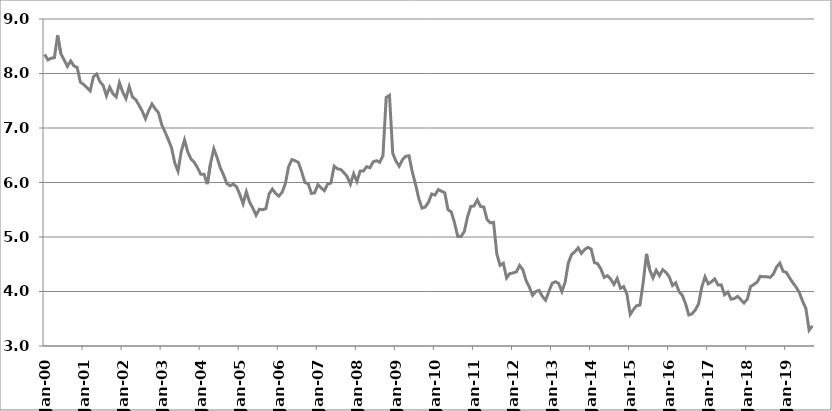
| Category | Series 1 |
|---|---|
| 2000-01-01 | 8.35 |
| 2000-02-01 | 8.25 |
| 2000-03-01 | 8.28 |
| 2000-04-01 | 8.29 |
| 2000-05-01 | 8.7 |
| 2000-06-01 | 8.36 |
| 2000-07-01 | 8.25 |
| 2000-08-01 | 8.13 |
| 2000-09-01 | 8.23 |
| 2000-10-01 | 8.14 |
| 2000-11-01 | 8.11 |
| 2000-12-01 | 7.84 |
| 2001-01-01 | 7.8 |
| 2001-02-01 | 7.74 |
| 2001-03-01 | 7.68 |
| 2001-04-01 | 7.94 |
| 2001-05-01 | 7.99 |
| 2001-06-01 | 7.85 |
| 2001-07-01 | 7.78 |
| 2001-08-01 | 7.59 |
| 2001-09-01 | 7.75 |
| 2001-10-01 | 7.63 |
| 2001-11-01 | 7.57 |
| 2001-12-01 | 7.83 |
| 2002-01-01 | 7.66 |
| 2002-02-01 | 7.54 |
| 2002-03-01 | 7.76 |
| 2002-04-01 | 7.57 |
| 2002-05-01 | 7.52 |
| 2002-06-01 | 7.42 |
| 2002-07-01 | 7.31 |
| 2002-08-01 | 7.17 |
| 2002-09-01 | 7.32 |
| 2002-10-01 | 7.44 |
| 2002-11-01 | 7.35 |
| 2002-12-01 | 7.28 |
| 2003-01-01 | 7.06 |
| 2003-02-01 | 6.93 |
| 2003-03-01 | 6.79 |
| 2003-04-01 | 6.64 |
| 2003-05-01 | 6.36 |
| 2003-06-01 | 6.21 |
| 2003-07-01 | 6.57 |
| 2003-08-01 | 6.78 |
| 2003-09-01 | 6.56 |
| 2003-10-01 | 6.43 |
| 2003-11-01 | 6.37 |
| 2003-12-01 | 6.27 |
| 2004-01-01 | 6.15 |
| 2004-02-01 | 6.15 |
| 2004-03-01 | 5.97 |
| 2004-04-01 | 6.35 |
| 2004-05-01 | 6.62 |
| 2004-06-01 | 6.46 |
| 2004-07-01 | 6.27 |
| 2004-08-01 | 6.14 |
| 2004-09-01 | 5.98 |
| 2004-10-01 | 5.94 |
| 2004-11-01 | 5.97 |
| 2004-12-01 | 5.92 |
| 2005-01-01 | 5.78 |
| 2005-02-01 | 5.61 |
| 2005-03-01 | 5.83 |
| 2005-04-01 | 5.64 |
| 2005-05-01 | 5.53 |
| 2005-06-01 | 5.4 |
| 2005-07-01 | 5.51 |
| 2005-08-01 | 5.5 |
| 2005-09-01 | 5.52 |
| 2005-10-01 | 5.79 |
| 2005-11-01 | 5.88 |
| 2005-12-01 | 5.8 |
| 2006-01-01 | 5.75 |
| 2006-02-01 | 5.82 |
| 2006-03-01 | 5.98 |
| 2006-04-01 | 6.29 |
| 2006-05-01 | 6.42 |
| 2006-06-01 | 6.4 |
| 2006-07-01 | 6.37 |
| 2006-08-01 | 6.2 |
| 2006-09-01 | 6 |
| 2006-10-01 | 5.98 |
| 2006-11-01 | 5.8 |
| 2006-12-01 | 5.81 |
| 2007-01-01 | 5.96 |
| 2007-02-01 | 5.9 |
| 2007-03-01 | 5.85 |
| 2007-04-01 | 5.97 |
| 2007-05-01 | 5.99 |
| 2007-06-01 | 6.3 |
| 2007-07-01 | 6.25 |
| 2007-08-01 | 6.24 |
| 2007-09-01 | 6.18 |
| 2007-10-01 | 6.11 |
| 2007-11-01 | 5.97 |
| 2007-12-01 | 6.16 |
| 2008-01-01 | 6.02 |
| 2008-02-01 | 6.21 |
| 2008-03-01 | 6.21 |
| 2008-04-01 | 6.29 |
| 2008-05-01 | 6.27 |
| 2008-06-01 | 6.38 |
| 2008-07-01 | 6.4 |
| 2008-08-01 | 6.37 |
| 2008-09-01 | 6.49 |
| 2008-10-01 | 7.56 |
| 2008-11-01 | 7.6 |
| 2008-12-01 | 6.54 |
| 2009-01-01 | 6.39 |
| 2009-02-01 | 6.3 |
| 2009-03-01 | 6.42 |
| 2009-04-01 | 6.48 |
| 2009-05-01 | 6.49 |
| 2009-06-01 | 6.2 |
| 2009-07-01 | 5.97 |
| 2009-08-01 | 5.71 |
| 2009-09-01 | 5.53 |
| 2009-10-01 | 5.55 |
| 2009-11-01 | 5.64 |
| 2009-12-01 | 5.79 |
| 2010-01-01 | 5.77 |
| 2010-02-01 | 5.87 |
| 2010-03-01 | 5.84 |
| 2010-04-01 | 5.81 |
| 2010-05-01 | 5.5 |
| 2010-06-01 | 5.46 |
| 2010-07-01 | 5.26 |
| 2010-08-01 | 5.01 |
| 2010-09-01 | 5.01 |
| 2010-10-01 | 5.1 |
| 2010-11-01 | 5.37 |
| 2010-12-01 | 5.56 |
| 2011-01-01 | 5.57 |
| 2011-02-01 | 5.68 |
| 2011-03-01 | 5.56 |
| 2011-04-01 | 5.55 |
| 2011-05-01 | 5.32 |
| 2011-06-01 | 5.26 |
| 2011-07-01 | 5.27 |
| 2011-08-01 | 4.69 |
| 2011-09-01 | 4.48 |
| 2011-10-01 | 4.52 |
| 2011-11-01 | 4.25 |
| 2011-12-01 | 4.33 |
| 2012-01-01 | 4.34 |
| 2012-02-01 | 4.36 |
| 2012-03-01 | 4.48 |
| 2012-04-01 | 4.4 |
| 2012-05-01 | 4.2 |
| 2012-06-01 | 4.08 |
| 2012-07-01 | 3.93 |
| 2012-08-01 | 4 |
| 2012-09-01 | 4.02 |
| 2012-10-01 | 3.91 |
| 2012-11-01 | 3.84 |
| 2012-12-01 | 4 |
| 2013-01-01 | 4.15 |
| 2013-02-01 | 4.18 |
| 2013-03-01 | 4.15 |
| 2013-04-01 | 4 |
| 2013-05-01 | 4.17 |
| 2013-06-01 | 4.53 |
| 2013-07-01 | 4.68 |
| 2013-08-01 | 4.73 |
| 2013-09-01 | 4.8 |
| 2013-10-01 | 4.7 |
| 2013-11-01 | 4.77 |
| 2013-12-01 | 4.81 |
| 2014-01-01 | 4.778 |
| 2014-02-01 | 4.53 |
| 2014-03-01 | 4.51 |
| 2014-04-01 | 4.41 |
| 2014-05-01 | 4.26 |
| 2014-06-01 | 4.29 |
| 2014-07-01 | 4.23 |
| 2014-08-01 | 4.13 |
| 2014-09-01 | 4.24 |
| 2014-10-01 | 4.06 |
| 2014-11-01 | 4.09 |
| 2014-12-01 | 3.95 |
| 2015-01-01 | 3.58 |
| 2015-02-01 | 3.67 |
| 2015-03-01 | 3.74 |
| 2015-04-01 | 3.75 |
| 2015-05-01 | 4.17 |
| 2015-06-01 | 4.69 |
| 2015-07-01 | 4.4 |
| 2015-08-01 | 4.25 |
| 2015-09-01 | 4.39 |
| 2015-10-01 | 4.29 |
| 2015-11-01 | 4.4 |
| 2015-12-01 | 4.35 |
| 2016-01-01 | 4.27 |
| 2016-02-01 | 4.11 |
| 2016-03-01 | 4.16 |
| 2016-04-01 | 4 |
| 2016-05-01 | 3.93 |
| 2016-06-01 | 3.78 |
| 2016-07-01 | 3.57 |
| 2016-08-01 | 3.59 |
| 2016-09-01 | 3.66 |
| 2016-10-01 | 3.77 |
| 2016-11-01 | 4.08 |
| 2016-12-01 | 4.27 |
| 2017-01-01 | 4.14 |
| 2017-02-01 | 4.18 |
| 2017-03-01 | 4.23 |
| 2017-04-01 | 4.12 |
| 2017-05-01 | 4.12 |
| 2017-06-01 | 3.94 |
| 2017-07-01 | 3.99 |
| 2017-08-01 | 3.86 |
| 2017-09-01 | 3.87 |
| 2017-10-01 | 3.91 |
| 2017-11-01 | 3.85 |
| 2017-12-01 | 3.79 |
| 2018-01-01 | 3.86 |
| 2018-02-01 | 4.09 |
| 2018-03-01 | 4.13 |
| 2018-04-01 | 4.17 |
| 2018-05-01 | 4.28 |
| 2018-06-01 | 4.27 |
| 2018-07-01 | 4.27 |
| 2018-08-01 | 4.26 |
| 2018-09-01 | 4.32 |
| 2018-10-01 | 4.45 |
| 2018-11-01 | 4.52 |
| 2018-12-01 | 4.37 |
| 2019-01-01 | 4.35 |
| 2019-02-01 | 4.25 |
| 2019-03-01 | 4.16 |
| 2019-04-01 | 4.08 |
| 2019-05-01 | 3.98 |
| 2019-06-01 | 3.82 |
| 2019-07-01 | 3.69 |
| 2019-08-01 | 3.29 |
| 2019-09-01 | 3.37 |